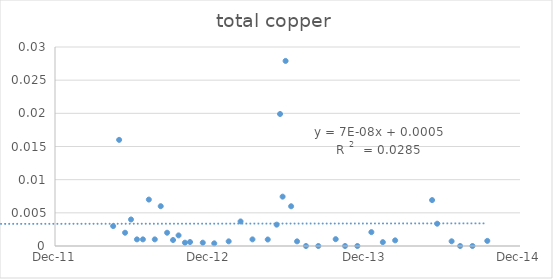
| Category | Series 0 |
|---|---|
| 41017.0 | 0.003 |
| 41031.0 | 0.016 |
| 41045.0 | 0.002 |
| 41059.0 | 0.004 |
| 41073.0 | 0.001 |
| 41087.0 | 0.001 |
| 41101.0 | 0.007 |
| 41115.0 | 0.001 |
| 41129.0 | 0.006 |
| 41144.0 | 0.002 |
| 41158.0 | 0.001 |
| 41171.0 | 0.002 |
| 41186.0 | 0 |
| 41198.0 | 0.001 |
| 41228.0 | 0 |
| 41255.0 | 0 |
| 41289.0 | 0.001 |
| 41317.0 | 0.004 |
| 41345.0 | 0.001 |
| 41381.0 | 0.001 |
| 41402.0 | 0.003 |
| 41410.0 | 0.02 |
| 41416.0 | 0.007 |
| 41423.0 | 0.028 |
| 41436.0 | 0.006 |
| 41450.0 | 0.001 |
| 41471.0 | 0 |
| 41500.0 | 0 |
| 41541.0 | 0.001 |
| 41563.0 | 0 |
| 41592.0 | 0 |
| 41625.0 | 0.002 |
| 41652.0 | 0.001 |
| 41681.0 | 0.001 |
| 41768.0 | 0.007 |
| 41780.0 | 0.003 |
| 41814.0 | 0.001 |
| 41834.0 | 0 |
| 41863.0 | 0 |
| 41898.0 | 0.001 |